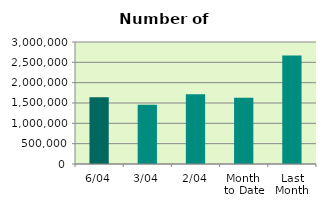
| Category | Series 0 |
|---|---|
| 6/04 | 1642562 |
| 3/04 | 1456278 |
| 2/04 | 1714486 |
| Month 
to Date | 1631663.5 |
| Last
Month | 2666736.455 |